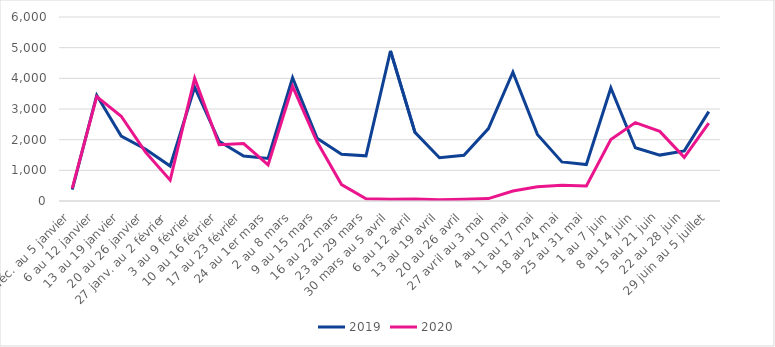
| Category | 2019 | 2020 |
|---|---|---|
| 30 déc. au 5 janvier | 369 | 411 |
| 6 au 12 janvier | 3446 | 3402 |
| 13 au 19 janvier | 2117 | 2765 |
| 20 au 26 janvier | 1689 | 1587 |
| 27 janv. au 2 février | 1140 | 678 |
| 3 au 9 février | 3711 | 4002 |
| 10 au 16 février | 1947 | 1835 |
| 17 au 23 février | 1464 | 1874 |
| 24 au 1er mars | 1389 | 1178 |
| 2 au 8 mars | 4019 | 3741 |
| 9 au 15 mars | 2049 | 1929 |
| 16 au 22 mars | 1525 | 536 |
| 23 au 29 mars | 1473 | 74 |
| 30 mars au 5 avril | 4896 | 61 |
| 6 au 12 avril | 2237 | 69 |
| 13 au 19 avril | 1410 | 40 |
| 20 au 26 avril | 1489 | 59 |
| 27 avril au 3 mai | 2361 | 79 |
| 4 au 10 mai | 4200 | 325 |
| 11 au 17 mai | 2172 | 463 |
| 18 au 24 mai | 1275 | 517 |
| 25 au 31 mai | 1190 | 489 |
| 1 au 7 juin | 3685 | 2004 |
| 8 au 14 juin | 1736 | 2556 |
| 15 au 21 juin | 1497 | 2270 |
| 22 au 28 juin | 1634 | 1422 |
| 29 juin au 5 juillet | 2913 | 2538 |